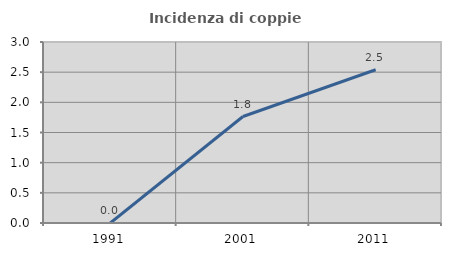
| Category | Incidenza di coppie miste |
|---|---|
| 1991.0 | 0 |
| 2001.0 | 1.765 |
| 2011.0 | 2.54 |